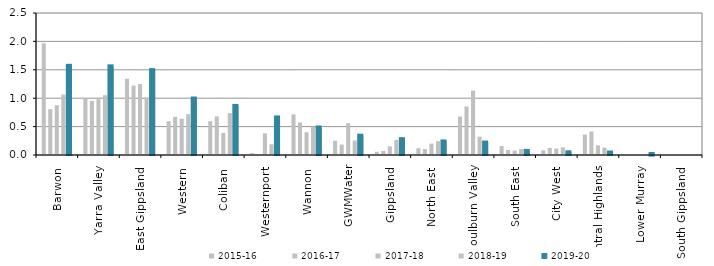
| Category | 2015-16 | 2016-17 | 2017-18 | 2018-19 | 2019-20 |
|---|---|---|---|---|---|
| Barwon  | 1.968 | 0.808 | 0.876 | 1.064 | 1.57 |
| Yarra Valley  | 0.986 | 0.953 | 0.981 | 1.053 | 1.561 |
| East Gippsland  | 1.342 | 1.222 | 1.249 | 1.01 | 1.494 |
| Western  | 0.594 | 0.672 | 0.639 | 0.719 | 0.994 |
| Coliban  | 0.596 | 0.68 | 0.388 | 0.737 | 0.864 |
| Westernport  | 0.034 | 0.013 | 0.381 | 0.189 | 0.662 |
| Wannon  | 0.715 | 0.572 | 0.398 | 0.499 | 0.484 |
| GWMWater | 0.253 | 0.185 | 0.56 | 0.257 | 0.34 |
| Gippsland  | 0.057 | 0.07 | 0.152 | 0.265 | 0.279 |
| North East  | 0.12 | 0.105 | 0.2 | 0.243 | 0.239 |
| Goulburn Valley  | 0.678 | 0.855 | 1.133 | 0.322 | 0.219 |
| South East  | 0.157 | 0.089 | 0.078 | 0.105 | 0.071 |
| City West  | 0.084 | 0.125 | 0.115 | 0.135 | 0.048 |
| Central Highlands  | 0.36 | 0.413 | 0.169 | 0.129 | 0.044 |
| Lower Murray  | 0 | 0 | 0 | 0 | 0.007 |
| South Gippsland  | 0.018 | 0.018 | 0 | 0.006 | 0 |